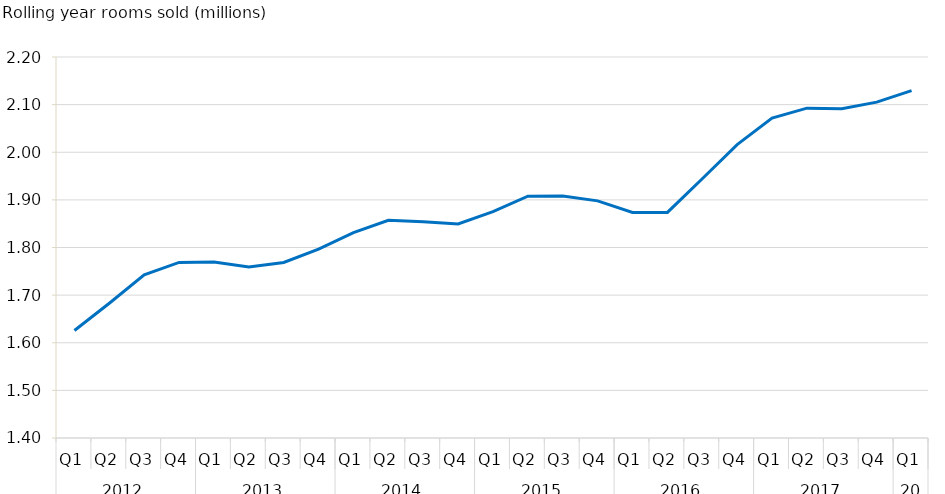
| Category | Series 0 |
|---|---|
| 0 | 1625798.175 |
| 1 | 1682986.282 |
| 2 | 1742794.791 |
| 3 | 1768685.123 |
| 4 | 1769588.225 |
| 5 | 1758950.115 |
| 6 | 1768672.827 |
| 7 | 1796703.317 |
| 8 | 1831335.384 |
| 9 | 1857225.461 |
| 10 | 1854028.286 |
| 11 | 1849521.422 |
| 12 | 1875195.63 |
| 13 | 1907646.356 |
| 14 | 1907929.166 |
| 15 | 1897876.32 |
| 16 | 1873411.233 |
| 17 | 1873676.965 |
| 18 | 1944377.589 |
| 19 | 2016024.39 |
| 20 | 2071677.816 |
| 21 | 2092588.888 |
| 22 | 2091495.934 |
| 23 | 2105193.618 |
| 24 | 2129307.621 |